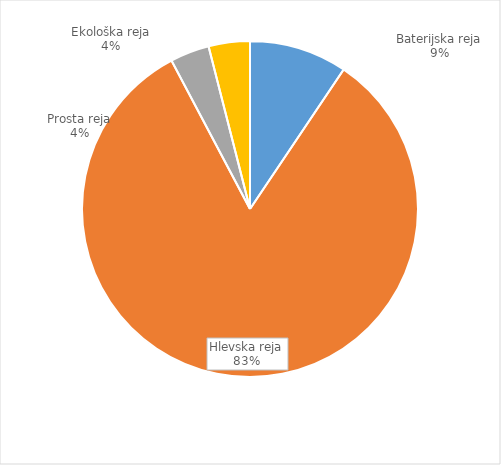
| Category | Količina kosov jajc |
|---|---|
| Baterijska reja | 289311 |
| Hlevska reja | 2547186 |
| Prosta reja | 116028 |
| Ekološka reja | 122080 |